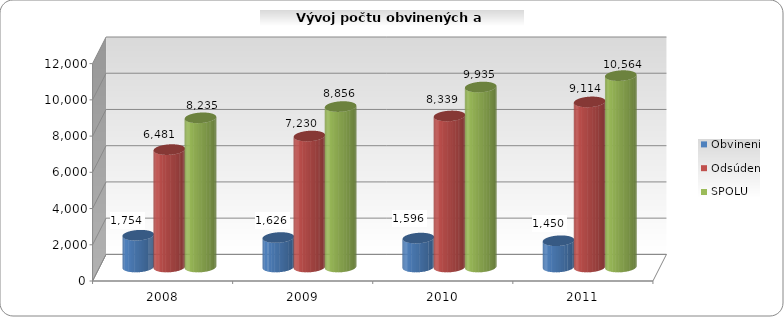
| Category | Obvinení | Odsúdení | SPOLU |
|---|---|---|---|
| 2008.0 | 1754 | 6481 | 8235 |
| 2009.0 | 1626 | 7230 | 8856 |
| 2010.0 | 1596 | 8339 | 9935 |
| 2011.0 | 1450 | 9114 | 10564 |